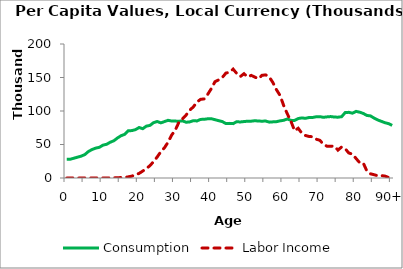
| Category | Consumption | Labor Income |
|---|---|---|
| 0 | 28140.999 | 0 |
|  | 28076.671 | 0 |
| 2 | 29605.539 | 2.196 |
| 3 | 31134.407 | 7.668 |
| 4 | 32682.511 | 10.244 |
| 5 | 35018.895 | 14.267 |
| 6 | 39654.78 | 30.111 |
| 7 | 42522.951 | 48.877 |
| 8 | 44642.888 | 85.782 |
| 9 | 45750.54 | 103.383 |
| 10 | 49058.833 | 137.227 |
| 11 | 50273.782 | 145.354 |
| 12 | 53358.785 | 201.69 |
| 13 | 55566.081 | 253.185 |
| 14 | 59665.982 | 380.83 |
| 15 | 63101.768 | 683.94 |
| 16 | 65148.029 | 915.63 |
| 17 | 70470.731 | 1683.635 |
| 18 | 70752.989 | 2804.905 |
| 19 | 72166.528 | 4912.868 |
| 20 | 75384.487 | 6863.684 |
| 21 | 73525.476 | 10343.612 |
| 22 | 77407.255 | 14008.191 |
| 23 | 78499.251 | 18492.097 |
| 24 | 82623.445 | 24485.553 |
| 25 | 84310.091 | 31400.463 |
| 26 | 82337.27 | 39151.554 |
| 27 | 84165.961 | 45080.641 |
| 28 | 86089.71 | 53362.479 |
| 29 | 85063.995 | 64083.858 |
| 30 | 84939.044 | 71490.755 |
| 31 | 84730.699 | 83088.671 |
| 32 | 85310.407 | 88237.324 |
| 33 | 83217.92 | 93985.298 |
| 34 | 83693.439 | 101275.775 |
| 35 | 85550.361 | 106114.156 |
| 36 | 85173.766 | 113324.123 |
| 37 | 87460.874 | 117408.88 |
| 38 | 87605.9 | 118046.478 |
| 39 | 88419.448 | 125110.963 |
| 40 | 88403.536 | 133684.734 |
| 41 | 87016.725 | 143845.476 |
| 42 | 85549.646 | 146399.276 |
| 43 | 84216.293 | 149984.365 |
| 44 | 81248.646 | 156565.313 |
| 45 | 81535.942 | 157831.199 |
| 46 | 81155.938 | 162527.894 |
| 47 | 84024.344 | 156026.211 |
| 48 | 83625.444 | 151400.521 |
| 49 | 84240.119 | 155629.571 |
| 50 | 84747.818 | 150867.055 |
| 51 | 84807.256 | 153163.112 |
| 52 | 85504.48 | 150615.02 |
| 53 | 85014.975 | 148120.648 |
| 54 | 84781.879 | 153246.23 |
| 55 | 85044.639 | 153889.307 |
| 56 | 83376.896 | 150792.115 |
| 57 | 83786.825 | 142494.671 |
| 58 | 84094.585 | 131679.855 |
| 59 | 85299.728 | 123021.758 |
| 60 | 86153.179 | 107982.336 |
| 61 | 88073.469 | 95621.382 |
| 62 | 86020.818 | 84671.1 |
| 63 | 85899.49 | 70573.628 |
| 64 | 88726.161 | 74208.463 |
| 65 | 89691.901 | 66906.67 |
| 66 | 89003.894 | 63474.85 |
| 67 | 90309.3 | 61981.121 |
| 68 | 90365.31 | 61601.267 |
| 69 | 91432.324 | 57882.68 |
| 70 | 91553.219 | 56264.632 |
| 71 | 90589.727 | 50054.684 |
| 72 | 91244.487 | 47382.461 |
| 73 | 91686.602 | 47508.23 |
| 74 | 90988.605 | 47518.441 |
| 75 | 90771.288 | 41647.681 |
| 76 | 91498.701 | 46295.803 |
| 77 | 97659.852 | 43671.843 |
| 78 | 97997.899 | 37312.929 |
| 79 | 96752.748 | 35604.459 |
| 80 | 99431.379 | 29178.323 |
| 81 | 98216.44 | 22865.262 |
| 82 | 96361.946 | 22366.459 |
| 83 | 93379.071 | 10429.535 |
| 84 | 92694.608 | 6227.623 |
| 85 | 89406.511 | 4876.054 |
| 86 | 86623.263 | 3332.648 |
| 87 | 84575.197 | 3569.272 |
| 88 | 82527.131 | 2840.071 |
| 89 | 81133.065 | 795.371 |
| 90+ | 78430.999 | 756.686 |